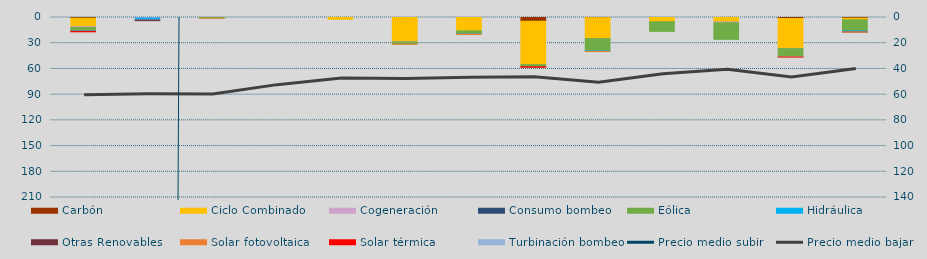
| Category | Carbón | Ciclo Combinado | Cogeneración | Consumo bombeo | Eólica | Hidráulica | Otras Renovables | Solar fotovoltaica | Solar térmica | Turbinación bombeo |
|---|---|---|---|---|---|---|---|---|---|---|
| 0 | 872 | 9746.8 | 968.1 |  | 3997.8 | 598.2 | 0 | 46.7 | 458.7 | 0 |
| 1 | 0 | 0 | 524.1 |  | 0 | 2473.2 | 672 | 0 | 0 | 0 |
| 2 | 0 | 0 | 0 |  | 757.3 | 0 | 0 | 12.2 | 0 | 0 |
| 3 | 0 | 0 | 0 |  | 0 | 0 | 0 | 0 | 0 | 0 |
| 4 | 0 | 2002 | 0 |  | 0 | 0 | 0 | 0 | 0 | 0 |
| 5 | 0 | 28154.5 | 304 |  | 2598.1 | 70.2 | 0 | 87.1 | 0 | 0 |
| 6 | 0 | 15599.6 | 0 |  | 3217.5 | 555 | 0 | 406.6 | 0 | 0 |
| 7 | 4394.5 | 50553 | 0 |  | 2251 | 0 | 467 | 33.2 | 196 | 0 |
| 8 | 167 | 24469.7 | 4.5 |  | 14472.2 | 627.8 | 0 | 21.8 | 0 | 0 |
| 9 | 0 | 4989.5 | 0 |  | 11218.3 | 8.9 | 0 | 0 | 0 | 0 |
| 10 | 0 | 5246.6 | 891.5 |  | 19357.7 | 73 | 0 | 0 | 0 | 0 |
| 11 | 1161 | 34847 | 340.9 |  | 9473.4 | 120 | 0 | 21.4 | 39.8 | 400 |
| 12 | 846 | 1898.8 | 0 |  | 12932.4 | 1173 | 80 | 33 | 0 | 0 |